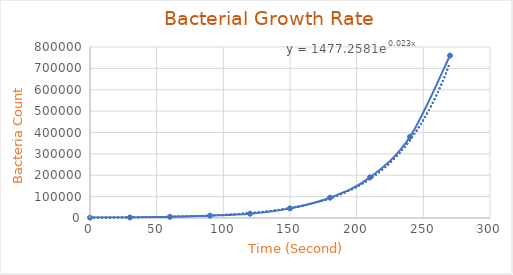
| Category | Series 0 |
|---|---|
| 0.0 | 2000 |
| 30.0 | 2500 |
| 60.0 | 5500 |
| 90.0 | 11000 |
| 120.0 | 20000 |
| 150.0 | 45000 |
| 180.0 | 95000 |
| 210.0 | 190000 |
| 240.0 | 380000 |
| 270.0 | 760000 |